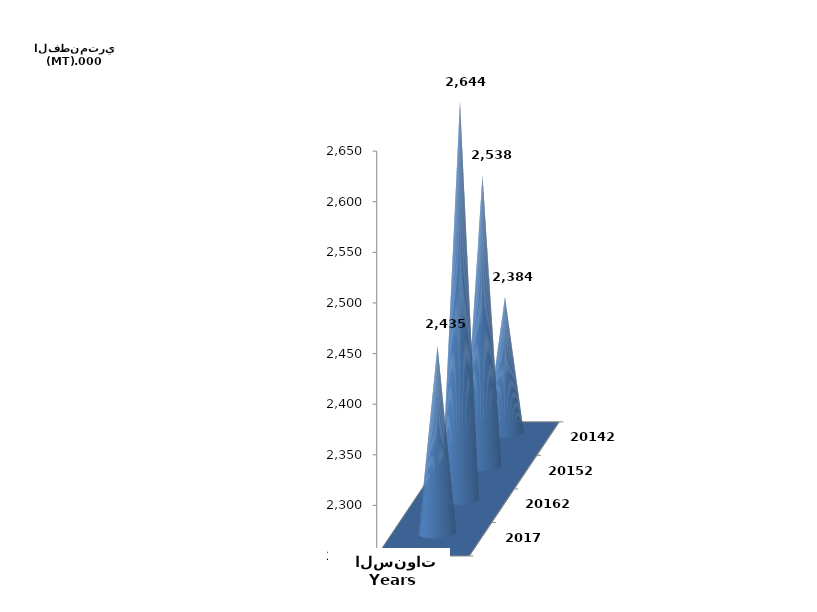
| Category | Series 0 | Series 1 |
|---|---|---|
| 20142 | 2384311 |  |
| 20152 | 2537530 |  |
| 20162 | 2643727.953 |  |
| 2017 | 2435155.083 |  |